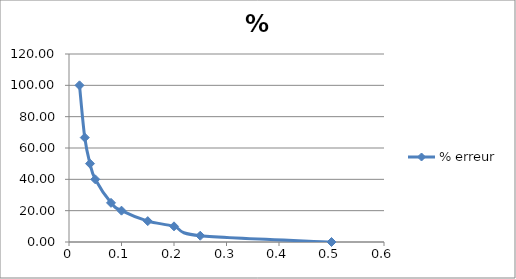
| Category | % erreur |
|---|---|
| 0.5 | 0 |
| 0.25 | 4 |
| 0.2 | 10 |
| 0.15 | 13.333 |
| 0.1 | 20 |
| 0.08 | 25 |
| 0.05 | 40 |
| 0.04 | 50 |
| 0.03 | 66.667 |
| 0.02 | 100 |